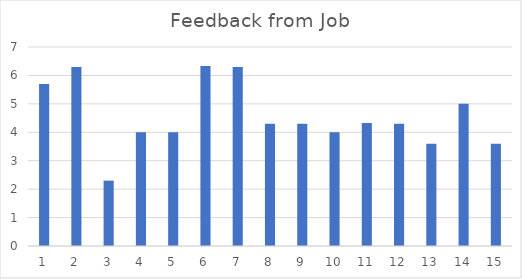
| Category | Feedback from Job |
|---|---|
| 0 | 5.7 |
| 1 | 6.3 |
| 2 | 2.3 |
| 3 | 4 |
| 4 | 4 |
| 5 | 6.33 |
| 6 | 6.3 |
| 7 | 4.3 |
| 8 | 4.3 |
| 9 | 4 |
| 10 | 4.33 |
| 11 | 4.3 |
| 12 | 3.6 |
| 13 | 5 |
| 14 | 3.6 |